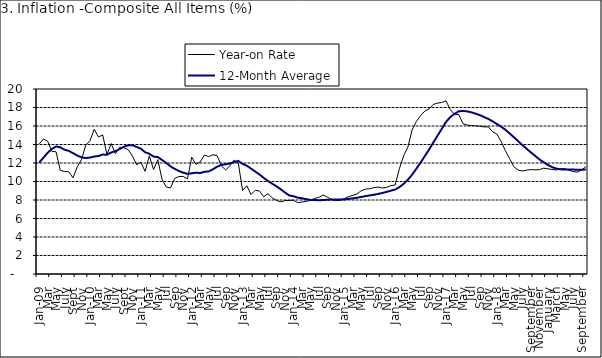
| Category | Year-on Rate | 12-Month Average |
|---|---|---|
| Jan-09 | 14.034 | 12.032 |
| Feb | 14.584 | 12.567 |
| Mar | 14.366 | 13.101 |
| Apr | 13.268 | 13.51 |
| May | 13.212 | 13.787 |
| June | 11.194 | 13.694 |
| July | 11.09 | 13.437 |
| Aug | 11.046 | 13.307 |
| Sept | 10.39 | 13.065 |
| Oct | 11.588 | 12.803 |
| Nov | 12.368 | 12.609 |
| Dec | 13.93 | 12.538 |
| Jan-10 | 14.398 | 12.586 |
| Feb | 15.649 | 12.7 |
| Mar | 14.812 | 12.757 |
| Apr | 15.044 | 12.915 |
| May | 12.915 | 12.893 |
| June | 14.099 | 13.132 |
| July | 13.002 | 13.284 |
| Aug | 13.702 | 13.5 |
| Sept | 13.65 | 13.764 |
| Oct | 13.45 | 13.908 |
| Nov | 12.766 | 13.928 |
| Dec | 11.815 | 13.74 |
| Jan-11 | 12.08 | 13.542 |
| Feb | 11.1 | 13.161 |
| Mar | 12.779 | 13.001 |
| Apr | 11.291 | 12.694 |
| May | 12.352 | 12.648 |
| Jun | 10.23 | 12.321 |
| Jul | 9.397 | 12.009 |
| Aug | 9.301 | 11.635 |
| Sep | 10.339 | 11.363 |
| Oct | 10.544 | 11.13 |
| Nov | 10.54 | 10.952 |
| Dec | 10.283 | 10.826 |
| Jan-12 | 12.626 | 10.886 |
| Feb | 11.866 | 10.955 |
| Mar | 12.111 | 10.914 |
| Apr | 12.866 | 11.054 |
| May | 12.688 | 11.096 |
| Jun | 12.892 | 11.32 |
| Jul | 12.797 | 11.599 |
| Aug | 11.689 | 11.791 |
| Sep | 11.253 | 11.859 |
| Oct | 11.693 | 11.948 |
| Nov | 12.32 | 12.091 |
| Dec | 11.981 | 12.224 |
| Jan-13 | 9.031 | 11.908 |
| Feb | 9.542 | 11.703 |
| Mar | 8.593 | 11.394 |
| Apr | 9.052 | 11.072 |
| May | 8.964 | 10.761 |
| Jun | 8.353 | 10.383 |
| Jul | 8.682 | 10.047 |
| Aug | 8.231 | 9.761 |
| Sep | 7.952 | 9.486 |
| Oct | 7.807 | 9.167 |
| Nov | 7.931 | 8.815 |
| Dec | 7.957 | 8.496 |
| Jan-14 | 7.977 | 8.408 |
| Feb | 7.707 | 8.257 |
| Mar | 7.783 | 8.19 |
| Apr | 7.851 | 8.092 |
| May | 7.965 | 8.012 |
| Jun | 8.167 | 7.998 |
| Jul | 8.281 | 7.968 |
| Aug | 8.534 | 7.996 |
| Sep | 8.317 | 8.027 |
| Oct | 8.06 | 8.047 |
| Nov | 7.927 | 8.046 |
| Dec | 7.978 | 8.047 |
| Jan-15 | 8.157 | 8.063 |
| Feb | 8.359 | 8.117 |
| Mar | 8.494 | 8.176 |
| Apr | 8.655 | 8.243 |
| May | 9.003 | 8.331 |
| Jun | 9.168 | 8.417 |
| Jul | 9.218 | 8.497 |
| Aug | 9.336 | 8.566 |
| Sep | 9.394 | 8.658 |
| Oct | 9.296 | 8.76 |
| Nov | 9.368 | 8.879 |
| Dec | 9.554 | 9.009 |
| Jan-16 | 9.617 | 9.13 |
| Feb | 11.379 | 9.386 |
| Mar | 12.775 | 9.751 |
| Apr | 13.721 | 10.182 |
| May | 15.577 | 10.746 |
| Jun | 16.48 | 11.372 |
| Jul | 17.127 | 12.045 |
| Aug | 17.609 | 12.744 |
| Sep | 17.852 | 13.454 |
| Oct | 18.33 | 14.206 |
| Nov | 18.476 | 14.958 |
| Dec | 18.547 | 15.697 |
| Jan-17 | 18.719 | 16.441 |
| Feb | 17.78 | 16.958 |
| Mar | 17.256 | 17.315 |
| Apr | 17.244 | 17.591 |
| May | 16.251 | 17.628 |
| Jun | 16.098 | 17.578 |
| Jul | 16.053 | 17.475 |
| Aug | 16.012 | 17.331 |
| Sep | 15.979 | 17.17 |
| Oct | 15.905 | 16.968 |
| Nov | 15.901 | 16.76 |
| Dec | 15.372 | 16.502 |
| Jan-18 | 15.127 | 16.215 |
| Feb | 14.33 | 15.93 |
| Mar | 13.337 | 15.599 |
| Apr | 12.482 | 15.196 |
| May | 11.608 | 14.793 |
| June | 11.231 | 14.371 |
| July | 11.142 | 13.95 |
| August | 11.227 | 13.546 |
| September | 11.284 | 13.157 |
| October | 11.259 | 12.777 |
| November | 11.281 | 12.406 |
| December | 11.442 | 12.095 |
| January | 11.374 | 11.801 |
| February | 11.306 | 11.564 |
| March | 11.251 | 11.401 |
| April | 11.372 | 11.314 |
| May | 11.396 | 11.299 |
| June | 11.217 | 11.297 |
| July | 11.084 | 11.291 |
| August | 11.016 | 11.271 |
| September | 11.244 | 11.268 |
| October | 11.607 | 11.298 |